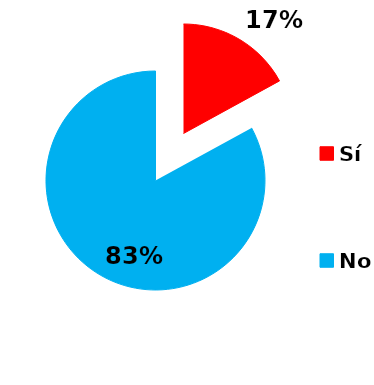
| Category | Series 0 |
|---|---|
| Sí | 24 |
| No | 117 |